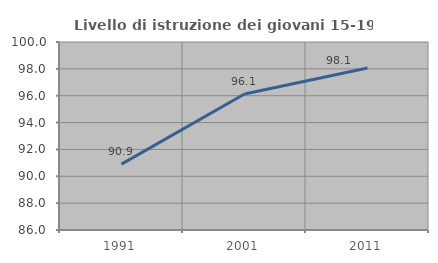
| Category | Livello di istruzione dei giovani 15-19 anni |
|---|---|
| 1991.0 | 90.905 |
| 2001.0 | 96.125 |
| 2011.0 | 98.07 |